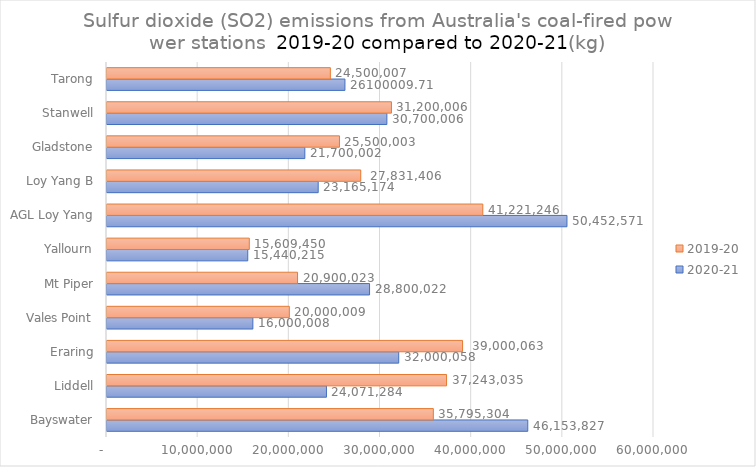
| Category | 2020-21 | 2019-20 |
|---|---|---|
| Bayswater | 46153826.632 | 35795303.679 |
| Liddell | 24071283.915 | 37243034.936 |
|  Eraring  | 32000058 | 39000063 |
| Vales Point | 16000008.3 | 20000008.7 |
| Mt Piper | 28800022.4 | 20900023.2 |
| Yallourn | 15440215 | 15609450 |
| AGL Loy Yang | 50452570.734 | 41221246.253 |
|  Loy Yang B  | 23165174.2 | 27831406.1 |
| Gladstone | 21700002.4 | 25500002.55 |
| Stanwell | 30700006.15 | 31200005.56 |
| Tarong | 26100009.71 | 24500006.69 |